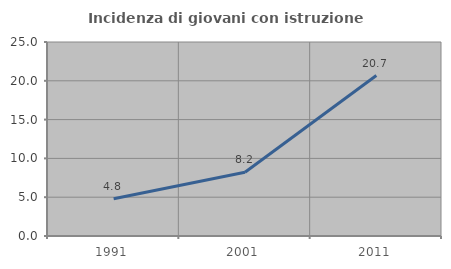
| Category | Incidenza di giovani con istruzione universitaria |
|---|---|
| 1991.0 | 4.808 |
| 2001.0 | 8.209 |
| 2011.0 | 20.675 |